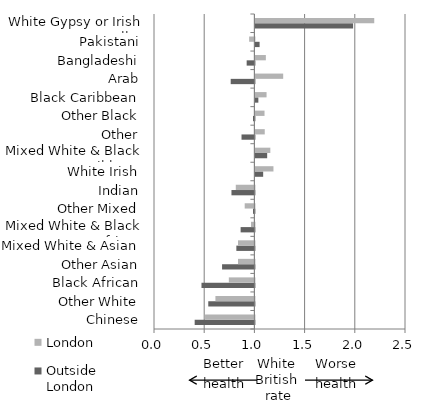
| Category | Outside London | London |
|---|---|---|
| Chinese | 0.405 | 0.508 |
| Other White | 0.541 | 0.612 |
| Black African | 0.473 | 0.745 |
| Other Asian | 0.678 | 0.837 |
| Mixed White & Asian | 0.82 | 0.837 |
| Mixed White & Black African | 0.863 | 0.967 |
| Other Mixed | 0.986 | 0.903 |
| Indian | 0.772 | 0.815 |
| White Irish | 1.077 | 1.18 |
| Mixed White & Black Caribbean | 1.117 | 1.149 |
| Other | 0.872 | 1.093 |
| Other Black | 0.986 | 1.091 |
| Black Caribbean | 1.029 | 1.111 |
| Arab | 0.764 | 1.277 |
| Bangladeshi | 0.923 | 1.104 |
| Pakistani | 1.042 | 0.948 |
| White Gypsy or Irish Traveller | 1.973 | 2.184 |